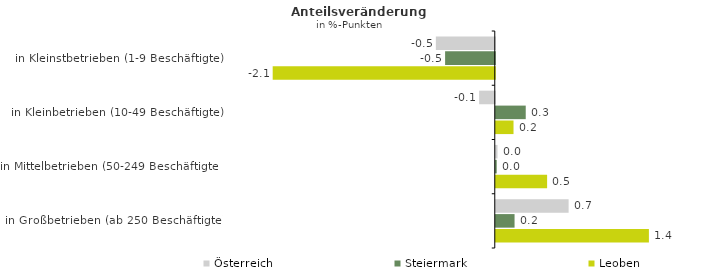
| Category | Österreich | Steiermark | Leoben |
|---|---|---|---|
| in Kleinstbetrieben (1-9 Beschäftigte) | -0.55 | -0.464 | -2.073 |
| in Kleinbetrieben (10-49 Beschäftigte) | -0.146 | 0.28 | 0.166 |
| in Mittelbetrieben (50-249 Beschäftigte) | 0.016 | 0.009 | 0.479 |
| in Großbetrieben (ab 250 Beschäftigte) | 0.68 | 0.175 | 1.43 |